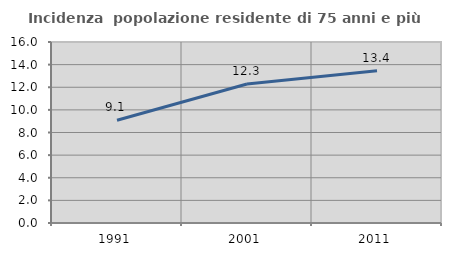
| Category | Incidenza  popolazione residente di 75 anni e più |
|---|---|
| 1991.0 | 9.083 |
| 2001.0 | 12.285 |
| 2011.0 | 13.448 |